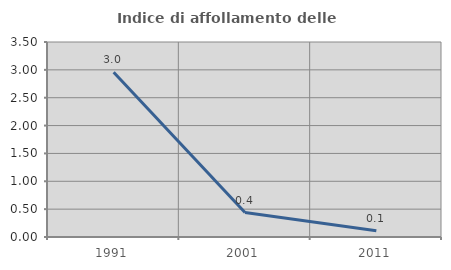
| Category | Indice di affollamento delle abitazioni  |
|---|---|
| 1991.0 | 2.959 |
| 2001.0 | 0.439 |
| 2011.0 | 0.112 |